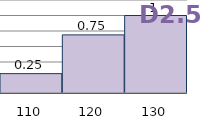
| Category | Series 1 |
|---|---|
| 110.0 | 0.25 |
| 120.0 | 0.75 |
| 130.0 | 1 |